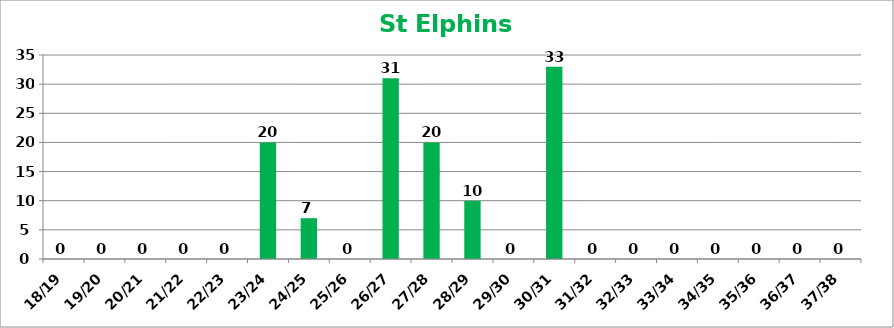
| Category | St Elphins Quarter |
|---|---|
| 18/19 | 0 |
| 19/20 | 0 |
| 20/21 | 0 |
| 21/22 | 0 |
| 22/23 | 0 |
| 23/24 | 20 |
| 24/25 | 7 |
| 25/26 | 0 |
| 26/27 | 31 |
| 27/28 | 20 |
| 28/29 | 10 |
| 29/30 | 0 |
| 30/31 | 33 |
| 31/32 | 0 |
| 32/33 | 0 |
| 33/34 | 0 |
| 34/35 | 0 |
| 35/36 | 0 |
| 36/37 | 0 |
| 37/38 | 0 |